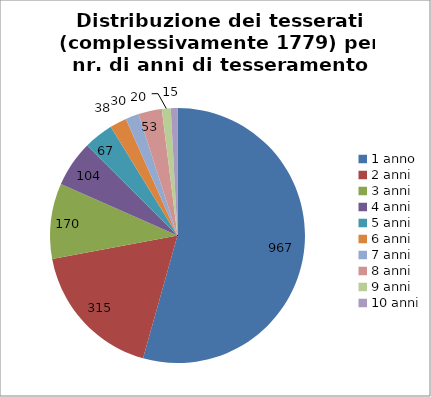
| Category | Nr. Tesserati |
|---|---|
| 1 anno | 967 |
| 2 anni | 315 |
| 3 anni | 170 |
| 4 anni | 104 |
| 5 anni | 67 |
| 6 anni | 38 |
| 7 anni | 30 |
| 8 anni | 53 |
| 9 anni | 20 |
| 10 anni | 15 |